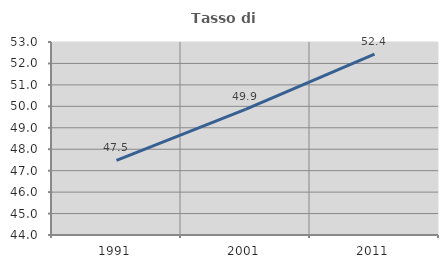
| Category | Tasso di occupazione   |
|---|---|
| 1991.0 | 47.484 |
| 2001.0 | 49.859 |
| 2011.0 | 52.434 |